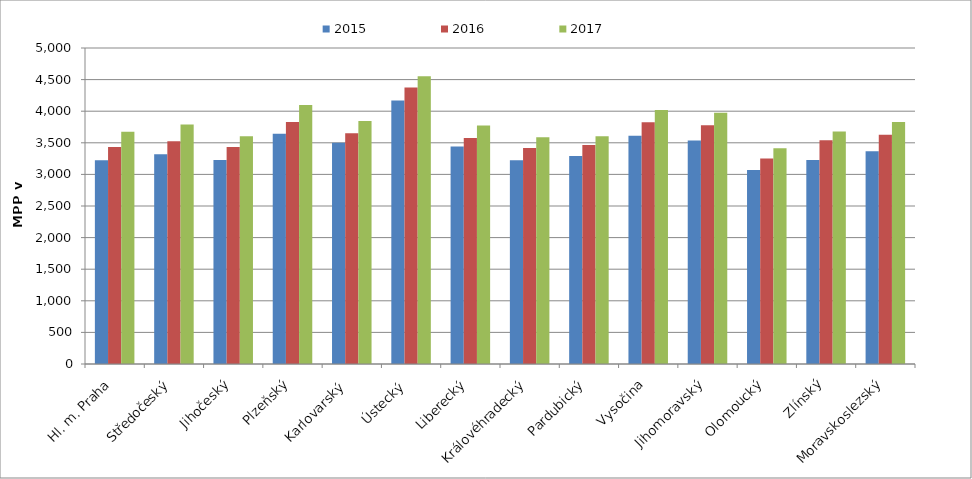
| Category | 2015 | 2016 | 2017 |
|---|---|---|---|
| Hl. m. Praha | 3223.095 | 3434.088 | 3674.426 |
| Středočeský | 3320.79 | 3524.73 | 3790.75 |
| Jihočeský | 3229.575 | 3433.071 | 3604.636 |
| Plzeňský | 3641.89 | 3829.684 | 4097.839 |
| Karlovarský  | 3499.277 | 3651.42 | 3845.056 |
| Ústecký   | 4167.863 | 4376.287 | 4551.326 |
| Liberecký | 3443.177 | 3577.207 | 3773.415 |
| Královéhradecký | 3223.09 | 3416.598 | 3587.428 |
| Pardubický | 3289.303 | 3465.373 | 3604.095 |
| Vysočina | 3611.017 | 3823.242 | 4017.492 |
| Jihomoravský | 3537.4 | 3775.9 | 3977.15 |
| Olomoucký | 3068.168 | 3252.282 | 3414.921 |
| Zlínský | 3228.689 | 3540.751 | 3678.447 |
| Moravskoslezský | 3367.565 | 3628.658 | 3828.474 |